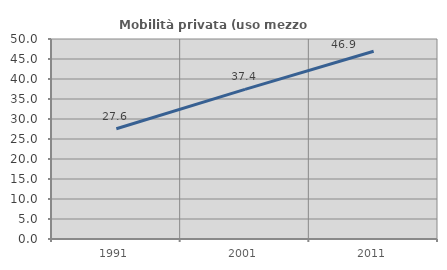
| Category | Mobilità privata (uso mezzo privato) |
|---|---|
| 1991.0 | 27.56 |
| 2001.0 | 37.416 |
| 2011.0 | 46.931 |